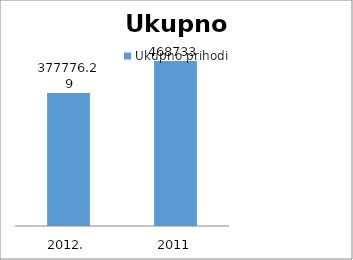
| Category | Ukupno prihodi |
|---|---|
| 2012. | 377776.29 |
| 2011 | 468733 |